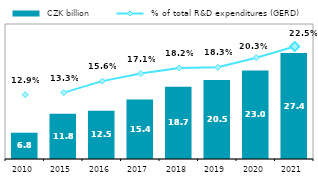
| Category |  CZK billion |
|---|---|
| 2010.0 | 6.811 |
| 2015.0 | 11.763 |
| 2016.0 | 12.477 |
| 2017.0 | 15.448 |
| 2018.0 | 18.72 |
| 2019.0 | 20.474 |
| 2020.0 | 22.975 |
| 2021.0 | 27.45 |